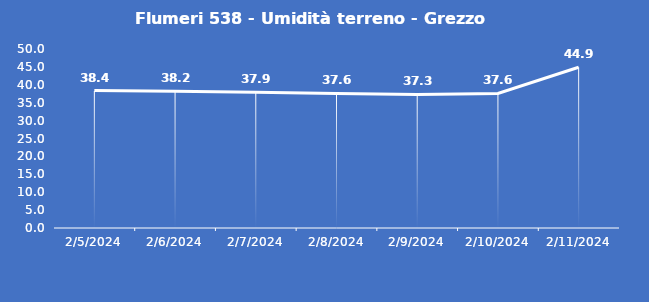
| Category | Flumeri 538 - Umidità terreno - Grezzo (%VWC) |
|---|---|
| 2/5/24 | 38.4 |
| 2/6/24 | 38.2 |
| 2/7/24 | 37.9 |
| 2/8/24 | 37.6 |
| 2/9/24 | 37.3 |
| 2/10/24 | 37.6 |
| 2/11/24 | 44.9 |